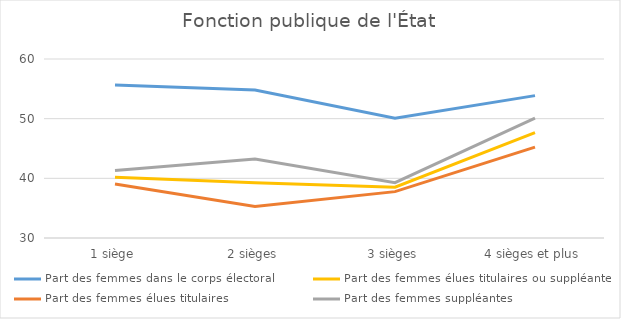
| Category | Part des femmes dans le corps électoral | Part des femmes élues titulaires ou suppléantes | Part des femmes élues titulaires | Part des femmes suppléantes |
|---|---|---|---|---|
| 1 siège | 55.64 | 40.172 | 39.043 | 41.301 |
| 2 sièges | 54.8 | 39.248 | 35.276 | 43.22 |
| 3 sièges | 50.07 | 38.52 | 37.768 | 39.272 |
| 4 sièges et plus | 53.86 | 47.673 | 45.24 | 50.106 |